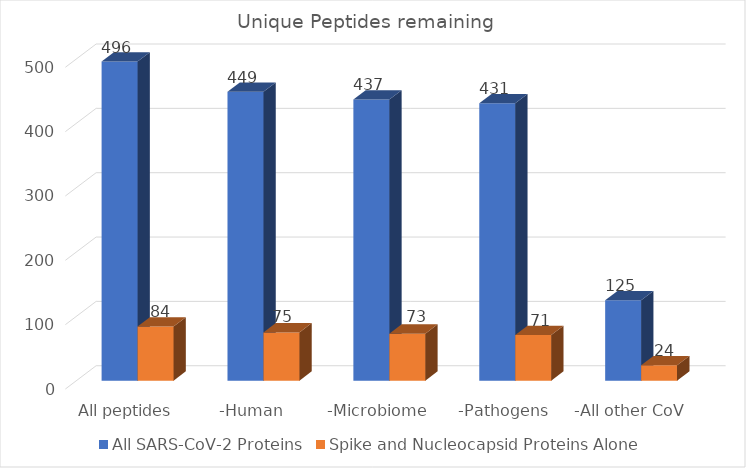
| Category | All SARS-CoV-2 Proteins | Spike and Nucleocapsid Proteins Alone |
|---|---|---|
| All peptides | 496 | 84 |
| -Human | 449 | 75 |
| -Microbiome | 437 | 73 |
| -Pathogens | 431 | 71 |
| -All other CoV | 125 | 24 |